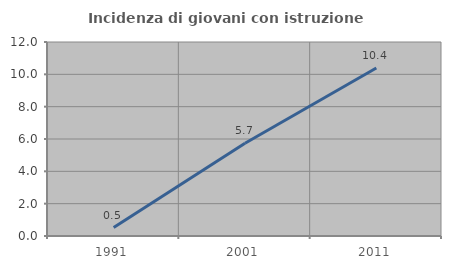
| Category | Incidenza di giovani con istruzione universitaria |
|---|---|
| 1991.0 | 0.521 |
| 2001.0 | 5.742 |
| 2011.0 | 10.39 |